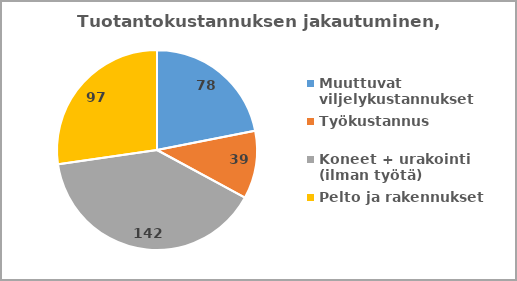
| Category | Series 0 |
|---|---|
| Muuttuvat viljelykustannukset | 77.995 |
| Työkustannus | 39.041 |
| Koneet + urakointi (ilman työtä) | 141.665 |
| Pelto ja rakennukset | 97.112 |